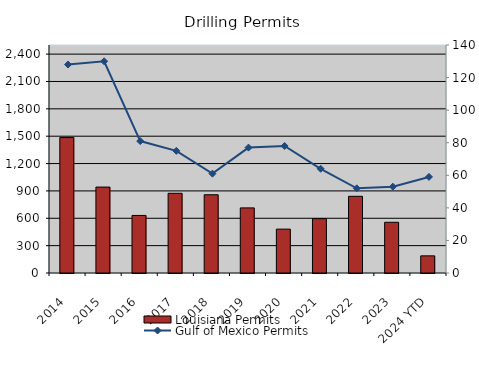
| Category | Louisiana Permits |
|---|---|
| 2014 | 1486 |
| 2015 | 942 |
| 2016 | 631 |
| 2017 | 874 |
| 2018 | 858 |
| 2019 | 714 |
| 2020 | 481 |
| 2021 | 596 |
| 2022 | 841 |
| 2023 | 556 |
| 2024 YTD | 188 |